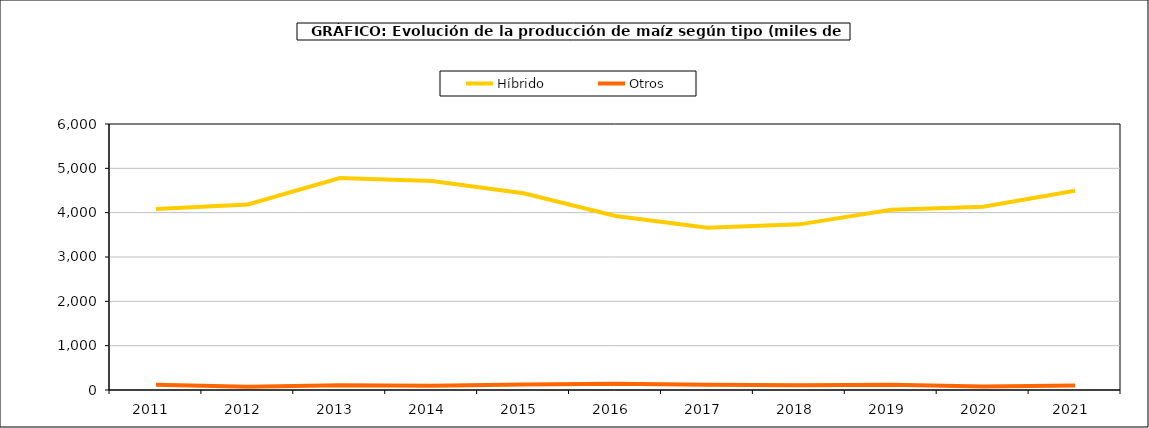
| Category | Híbrido | Otros |
|---|---|---|
| 2011  | 4084.167 | 115.76 |
| 2012  | 4186.073 | 75.996 |
| 2013  | 4779.482 | 108.979 |
| 2014  | 4715.168 | 95.477 |
| 2015  | 4439.372 | 125.044 |
| 2016  | 3925.755 | 143.753 |
| 2017  | 3659.487 | 116.158 |
| 2018  | 3736.182 | 106.337 |
| 2019  | 4067.716 | 116.743 |
| 2020  | 4134.991 | 79.111 |
| 2021  | 4493.822 | 103.836 |